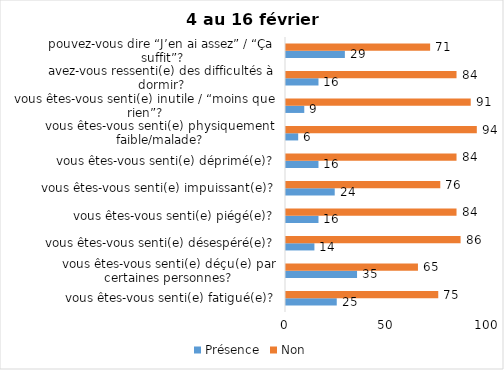
| Category | Présence | Non |
|---|---|---|
| vous êtes-vous senti(e) fatigué(e)? | 25 | 75 |
| vous êtes-vous senti(e) déçu(e) par certaines personnes? | 35 | 65 |
| vous êtes-vous senti(e) désespéré(e)? | 14 | 86 |
| vous êtes-vous senti(e) piégé(e)? | 16 | 84 |
| vous êtes-vous senti(e) impuissant(e)? | 24 | 76 |
| vous êtes-vous senti(e) déprimé(e)? | 16 | 84 |
| vous êtes-vous senti(e) physiquement faible/malade? | 6 | 94 |
| vous êtes-vous senti(e) inutile / “moins que rien”? | 9 | 91 |
| avez-vous ressenti(e) des difficultés à dormir? | 16 | 84 |
| pouvez-vous dire “J’en ai assez” / “Ça suffit”? | 29 | 71 |